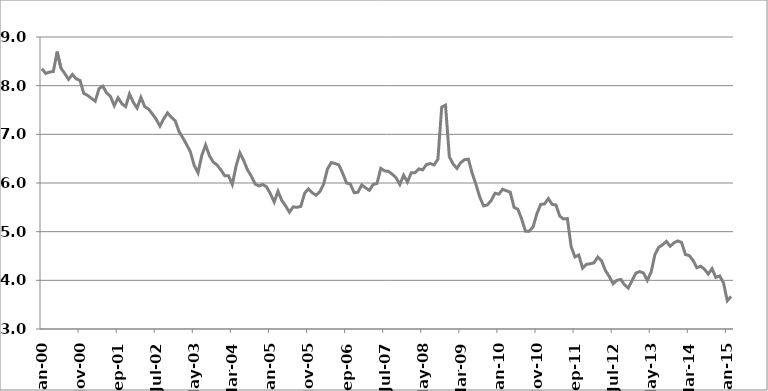
| Category | Series 1 |
|---|---|
| 2000-01-01 | 8.35 |
| 2000-02-01 | 8.25 |
| 2000-03-01 | 8.28 |
| 2000-04-01 | 8.29 |
| 2000-05-01 | 8.7 |
| 2000-06-01 | 8.36 |
| 2000-07-01 | 8.25 |
| 2000-08-01 | 8.13 |
| 2000-09-01 | 8.23 |
| 2000-10-01 | 8.14 |
| 2000-11-01 | 8.11 |
| 2000-12-01 | 7.84 |
| 2001-01-01 | 7.8 |
| 2001-02-01 | 7.74 |
| 2001-03-01 | 7.68 |
| 2001-04-01 | 7.94 |
| 2001-05-01 | 7.99 |
| 2001-06-01 | 7.85 |
| 2001-07-01 | 7.78 |
| 2001-08-01 | 7.59 |
| 2001-09-01 | 7.75 |
| 2001-10-01 | 7.63 |
| 2001-11-01 | 7.57 |
| 2001-12-01 | 7.83 |
| 2002-01-01 | 7.66 |
| 2002-02-01 | 7.54 |
| 2002-03-01 | 7.76 |
| 2002-04-01 | 7.57 |
| 2002-05-01 | 7.52 |
| 2002-06-01 | 7.42 |
| 2002-07-01 | 7.31 |
| 2002-08-01 | 7.17 |
| 2002-09-01 | 7.32 |
| 2002-10-01 | 7.44 |
| 2002-11-01 | 7.35 |
| 2002-12-01 | 7.28 |
| 2003-01-01 | 7.06 |
| 2003-02-01 | 6.93 |
| 2003-03-01 | 6.79 |
| 2003-04-01 | 6.64 |
| 2003-05-01 | 6.36 |
| 2003-06-01 | 6.21 |
| 2003-07-01 | 6.57 |
| 2003-08-01 | 6.78 |
| 2003-09-01 | 6.56 |
| 2003-10-01 | 6.43 |
| 2003-11-01 | 6.37 |
| 2003-12-01 | 6.27 |
| 2004-01-01 | 6.15 |
| 2004-02-01 | 6.15 |
| 2004-03-01 | 5.97 |
| 2004-04-01 | 6.35 |
| 2004-05-01 | 6.62 |
| 2004-06-01 | 6.46 |
| 2004-07-01 | 6.27 |
| 2004-08-01 | 6.14 |
| 2004-09-01 | 5.98 |
| 2004-10-01 | 5.94 |
| 2004-11-01 | 5.97 |
| 2004-12-01 | 5.92 |
| 2005-01-01 | 5.78 |
| 2005-02-01 | 5.61 |
| 2005-03-01 | 5.83 |
| 2005-04-01 | 5.64 |
| 2005-05-01 | 5.53 |
| 2005-06-01 | 5.4 |
| 2005-07-01 | 5.51 |
| 2005-08-01 | 5.5 |
| 2005-09-01 | 5.52 |
| 2005-10-01 | 5.79 |
| 2005-11-01 | 5.88 |
| 2005-12-01 | 5.8 |
| 2006-01-01 | 5.75 |
| 2006-02-01 | 5.82 |
| 2006-03-01 | 5.98 |
| 2006-04-01 | 6.29 |
| 2006-05-01 | 6.42 |
| 2006-06-01 | 6.4 |
| 2006-07-01 | 6.37 |
| 2006-08-01 | 6.2 |
| 2006-09-01 | 6 |
| 2006-10-01 | 5.98 |
| 2006-11-01 | 5.8 |
| 2006-12-01 | 5.81 |
| 2007-01-01 | 5.96 |
| 2007-02-01 | 5.9 |
| 2007-03-01 | 5.85 |
| 2007-04-01 | 5.97 |
| 2007-05-01 | 5.99 |
| 2007-06-01 | 6.3 |
| 2007-07-01 | 6.25 |
| 2007-08-01 | 6.24 |
| 2007-09-01 | 6.18 |
| 2007-10-01 | 6.11 |
| 2007-11-01 | 5.97 |
| 2007-12-01 | 6.16 |
| 2008-01-01 | 6.02 |
| 2008-02-01 | 6.21 |
| 2008-03-01 | 6.21 |
| 2008-04-01 | 6.29 |
| 2008-05-01 | 6.27 |
| 2008-06-01 | 6.38 |
| 2008-07-01 | 6.4 |
| 2008-08-01 | 6.37 |
| 2008-09-01 | 6.49 |
| 2008-10-01 | 7.56 |
| 2008-11-01 | 7.6 |
| 2008-12-01 | 6.54 |
| 2009-01-01 | 6.39 |
| 2009-02-01 | 6.3 |
| 2009-03-01 | 6.42 |
| 2009-04-01 | 6.48 |
| 2009-05-01 | 6.49 |
| 2009-06-01 | 6.2 |
| 2009-07-01 | 5.97 |
| 2009-08-01 | 5.71 |
| 2009-09-01 | 5.53 |
| 2009-10-01 | 5.55 |
| 2009-11-01 | 5.64 |
| 2009-12-01 | 5.79 |
| 2010-01-01 | 5.77 |
| 2010-02-01 | 5.87 |
| 2010-03-01 | 5.84 |
| 2010-04-01 | 5.81 |
| 2010-05-01 | 5.5 |
| 2010-06-01 | 5.46 |
| 2010-07-01 | 5.26 |
| 2010-08-01 | 5.01 |
| 2010-09-01 | 5.01 |
| 2010-10-01 | 5.1 |
| 2010-11-01 | 5.37 |
| 2010-12-01 | 5.56 |
| 2011-01-01 | 5.57 |
| 2011-02-01 | 5.68 |
| 2011-03-01 | 5.56 |
| 2011-04-01 | 5.55 |
| 2011-05-01 | 5.32 |
| 2011-06-01 | 5.26 |
| 2011-07-01 | 5.27 |
| 2011-08-01 | 4.69 |
| 2011-09-01 | 4.48 |
| 2011-10-01 | 4.52 |
| 2011-11-01 | 4.25 |
| 2011-12-01 | 4.33 |
| 2012-01-01 | 4.34 |
| 2012-02-01 | 4.36 |
| 2012-03-01 | 4.48 |
| 2012-04-01 | 4.4 |
| 2012-05-01 | 4.2 |
| 2012-06-01 | 4.08 |
| 2012-07-01 | 3.93 |
| 2012-08-01 | 4 |
| 2012-09-01 | 4.02 |
| 2012-10-01 | 3.91 |
| 2012-11-01 | 3.84 |
| 2012-12-01 | 4 |
| 2013-01-01 | 4.15 |
| 2013-02-01 | 4.18 |
| 2013-03-01 | 4.15 |
| 2013-04-01 | 4 |
| 2013-05-01 | 4.17 |
| 2013-06-01 | 4.53 |
| 2013-07-01 | 4.68 |
| 2013-08-01 | 4.73 |
| 2013-09-01 | 4.8 |
| 2013-10-01 | 4.7 |
| 2013-11-01 | 4.77 |
| 2013-12-01 | 4.81 |
| 2014-01-01 | 4.778 |
| 2014-02-01 | 4.53 |
| 2014-03-01 | 4.51 |
| 2014-04-01 | 4.41 |
| 2014-05-01 | 4.26 |
| 2014-06-01 | 4.29 |
| 2014-07-01 | 4.23 |
| 2014-08-01 | 4.13 |
| 2014-09-01 | 4.24 |
| 2014-10-01 | 4.06 |
| 2014-11-01 | 4.09 |
| 2014-12-01 | 3.95 |
| 2015-01-01 | 3.58 |
| 2015-02-01 | 3.67 |